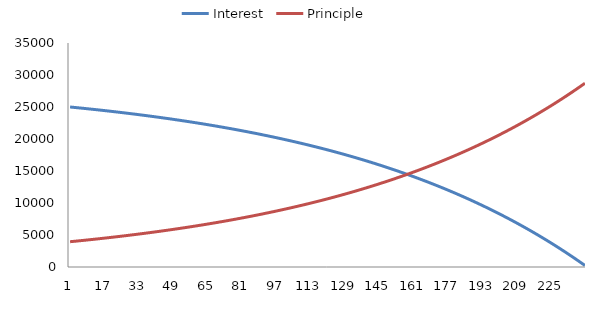
| Category | Interest | Principle |
|---|---|---|
| 0 | 25000 | 3950.649 |
| 1 | 24967.078 | 3983.571 |
| 2 | 24933.881 | 4016.768 |
| 3 | 24900.408 | 4050.241 |
| 4 | 24866.656 | 4083.993 |
| 5 | 24832.623 | 4118.026 |
| 6 | 24798.306 | 4152.343 |
| 7 | 24763.703 | 4186.946 |
| 8 | 24728.812 | 4221.837 |
| 9 | 24693.63 | 4257.019 |
| 10 | 24658.155 | 4292.494 |
| 11 | 24622.384 | 4328.265 |
| 12 | 24586.315 | 4364.334 |
| 13 | 24549.946 | 4400.703 |
| 14 | 24513.273 | 4437.376 |
| 15 | 24476.295 | 4474.354 |
| 16 | 24439.009 | 4511.64 |
| 17 | 24401.412 | 4549.237 |
| 18 | 24363.502 | 4587.148 |
| 19 | 24325.275 | 4625.374 |
| 20 | 24286.731 | 4663.919 |
| 21 | 24247.865 | 4702.785 |
| 22 | 24208.675 | 4741.975 |
| 23 | 24169.158 | 4781.491 |
| 24 | 24129.313 | 4821.337 |
| 25 | 24089.135 | 4861.515 |
| 26 | 24048.622 | 4902.027 |
| 27 | 24007.772 | 4942.877 |
| 28 | 23966.581 | 4984.068 |
| 29 | 23925.047 | 5025.602 |
| 30 | 23883.167 | 5067.482 |
| 31 | 23840.938 | 5109.711 |
| 32 | 23798.357 | 5152.292 |
| 33 | 23755.422 | 5195.228 |
| 34 | 23712.128 | 5238.521 |
| 35 | 23668.474 | 5282.176 |
| 36 | 23624.456 | 5326.194 |
| 37 | 23580.071 | 5370.579 |
| 38 | 23535.316 | 5415.333 |
| 39 | 23490.188 | 5460.461 |
| 40 | 23444.684 | 5505.965 |
| 41 | 23398.801 | 5551.848 |
| 42 | 23352.536 | 5598.114 |
| 43 | 23305.885 | 5644.765 |
| 44 | 23258.845 | 5691.804 |
| 45 | 23211.413 | 5739.236 |
| 46 | 23163.586 | 5787.063 |
| 47 | 23115.361 | 5835.288 |
| 48 | 23066.734 | 5883.916 |
| 49 | 23017.701 | 5932.948 |
| 50 | 22968.26 | 5982.39 |
| 51 | 22918.406 | 6032.243 |
| 52 | 22868.138 | 6082.512 |
| 53 | 22817.45 | 6133.199 |
| 54 | 22766.34 | 6184.309 |
| 55 | 22714.804 | 6235.845 |
| 56 | 22662.839 | 6287.81 |
| 57 | 22610.44 | 6340.209 |
| 58 | 22557.605 | 6393.044 |
| 59 | 22504.33 | 6446.319 |
| 60 | 22450.611 | 6500.039 |
| 61 | 22396.444 | 6554.206 |
| 62 | 22341.825 | 6608.824 |
| 63 | 22286.752 | 6663.898 |
| 64 | 22231.219 | 6719.43 |
| 65 | 22175.224 | 6775.425 |
| 66 | 22118.762 | 6831.887 |
| 67 | 22061.83 | 6888.82 |
| 68 | 22004.423 | 6946.226 |
| 69 | 21946.538 | 7004.112 |
| 70 | 21888.17 | 7062.479 |
| 71 | 21829.316 | 7121.333 |
| 72 | 21769.972 | 7180.678 |
| 73 | 21710.133 | 7240.517 |
| 74 | 21649.795 | 7300.854 |
| 75 | 21588.955 | 7361.695 |
| 76 | 21527.607 | 7423.042 |
| 77 | 21465.748 | 7484.901 |
| 78 | 21403.374 | 7547.275 |
| 79 | 21340.48 | 7610.169 |
| 80 | 21277.062 | 7673.587 |
| 81 | 21213.116 | 7737.534 |
| 82 | 21148.636 | 7802.013 |
| 83 | 21083.619 | 7867.03 |
| 84 | 21018.061 | 7932.588 |
| 85 | 20951.956 | 7998.693 |
| 86 | 20885.3 | 8065.349 |
| 87 | 20818.089 | 8132.56 |
| 88 | 20750.318 | 8200.332 |
| 89 | 20681.982 | 8268.668 |
| 90 | 20613.076 | 8337.573 |
| 91 | 20543.596 | 8407.053 |
| 92 | 20473.537 | 8477.112 |
| 93 | 20402.895 | 8547.755 |
| 94 | 20331.664 | 8618.986 |
| 95 | 20259.839 | 8690.811 |
| 96 | 20187.415 | 8763.234 |
| 97 | 20114.388 | 8836.261 |
| 98 | 20040.753 | 8909.897 |
| 99 | 19966.504 | 8984.146 |
| 100 | 19891.636 | 9059.014 |
| 101 | 19816.144 | 9134.505 |
| 102 | 19740.023 | 9210.626 |
| 103 | 19663.268 | 9287.381 |
| 104 | 19585.873 | 9364.776 |
| 105 | 19507.833 | 9442.816 |
| 106 | 19429.143 | 9521.506 |
| 107 | 19349.797 | 9600.852 |
| 108 | 19269.79 | 9680.859 |
| 109 | 19189.116 | 9761.533 |
| 110 | 19107.77 | 9842.879 |
| 111 | 19025.746 | 9924.903 |
| 112 | 18943.039 | 10007.611 |
| 113 | 18859.642 | 10091.007 |
| 114 | 18775.55 | 10175.099 |
| 115 | 18690.758 | 10259.892 |
| 116 | 18605.259 | 10345.391 |
| 117 | 18519.047 | 10431.602 |
| 118 | 18432.117 | 10518.532 |
| 119 | 18344.463 | 10606.187 |
| 120 | 18256.078 | 10694.572 |
| 121 | 18166.956 | 10783.693 |
| 122 | 18077.092 | 10873.557 |
| 123 | 17986.479 | 10964.17 |
| 124 | 17895.111 | 11055.538 |
| 125 | 17802.982 | 11147.668 |
| 126 | 17710.084 | 11240.565 |
| 127 | 17616.413 | 11334.236 |
| 128 | 17521.961 | 11428.688 |
| 129 | 17426.722 | 11523.927 |
| 130 | 17330.689 | 11619.96 |
| 131 | 17233.856 | 11716.793 |
| 132 | 17136.216 | 11814.433 |
| 133 | 17037.763 | 11912.887 |
| 134 | 16938.489 | 12012.161 |
| 135 | 16838.387 | 12112.262 |
| 136 | 16737.452 | 12213.198 |
| 137 | 16635.675 | 12314.974 |
| 138 | 16533.05 | 12417.599 |
| 139 | 16429.57 | 12521.079 |
| 140 | 16325.228 | 12625.421 |
| 141 | 16220.016 | 12730.633 |
| 142 | 16113.928 | 12836.722 |
| 143 | 16006.955 | 12943.695 |
| 144 | 15899.091 | 13051.559 |
| 145 | 15790.328 | 13160.322 |
| 146 | 15680.658 | 13269.991 |
| 147 | 15570.075 | 13380.574 |
| 148 | 15458.57 | 13492.079 |
| 149 | 15346.136 | 13604.513 |
| 150 | 15232.765 | 13717.884 |
| 151 | 15118.45 | 13832.2 |
| 152 | 15003.181 | 13947.468 |
| 153 | 14886.952 | 14063.697 |
| 154 | 14769.755 | 14180.894 |
| 155 | 14651.581 | 14299.068 |
| 156 | 14532.422 | 14418.227 |
| 157 | 14412.27 | 14538.379 |
| 158 | 14291.117 | 14659.532 |
| 159 | 14168.954 | 14781.695 |
| 160 | 14045.773 | 14904.876 |
| 161 | 13921.566 | 15029.083 |
| 162 | 13796.324 | 15154.326 |
| 163 | 13670.038 | 15280.612 |
| 164 | 13542.699 | 15407.95 |
| 165 | 13414.3 | 15536.35 |
| 166 | 13284.83 | 15665.819 |
| 167 | 13154.282 | 15796.368 |
| 168 | 13022.645 | 15928.004 |
| 169 | 12889.912 | 16060.738 |
| 170 | 12756.072 | 16194.577 |
| 171 | 12621.117 | 16329.532 |
| 172 | 12485.038 | 16465.611 |
| 173 | 12347.825 | 16602.825 |
| 174 | 12209.468 | 16741.182 |
| 175 | 12069.958 | 16880.691 |
| 176 | 11929.285 | 17021.364 |
| 177 | 11787.441 | 17163.209 |
| 178 | 11644.414 | 17306.235 |
| 179 | 11500.195 | 17450.454 |
| 180 | 11354.775 | 17595.874 |
| 181 | 11208.143 | 17742.507 |
| 182 | 11060.288 | 17890.361 |
| 183 | 10911.202 | 18039.447 |
| 184 | 10760.873 | 18189.776 |
| 185 | 10609.292 | 18341.357 |
| 186 | 10456.447 | 18494.202 |
| 187 | 10302.329 | 18648.32 |
| 188 | 10146.926 | 18803.723 |
| 189 | 9990.229 | 18960.421 |
| 190 | 9832.225 | 19118.424 |
| 191 | 9672.905 | 19277.745 |
| 192 | 9512.257 | 19438.392 |
| 193 | 9350.27 | 19600.379 |
| 194 | 9186.934 | 19763.715 |
| 195 | 9022.236 | 19928.413 |
| 196 | 8856.166 | 20094.483 |
| 197 | 8688.712 | 20261.937 |
| 198 | 8519.863 | 20430.787 |
| 199 | 8349.606 | 20601.043 |
| 200 | 8177.931 | 20772.719 |
| 201 | 8004.825 | 20945.825 |
| 202 | 7830.276 | 21120.373 |
| 203 | 7654.273 | 21296.376 |
| 204 | 7476.803 | 21473.846 |
| 205 | 7297.855 | 21652.795 |
| 206 | 7117.415 | 21833.235 |
| 207 | 6935.471 | 22015.178 |
| 208 | 6752.011 | 22198.638 |
| 209 | 6567.023 | 22383.627 |
| 210 | 6380.492 | 22570.157 |
| 211 | 6192.408 | 22758.242 |
| 212 | 6002.756 | 22947.894 |
| 213 | 5811.523 | 23139.126 |
| 214 | 5618.697 | 23331.952 |
| 215 | 5424.264 | 23526.385 |
| 216 | 5228.211 | 23722.438 |
| 217 | 5030.524 | 23920.125 |
| 218 | 4831.19 | 24119.46 |
| 219 | 4630.194 | 24320.455 |
| 220 | 4427.524 | 24523.126 |
| 221 | 4223.164 | 24727.485 |
| 222 | 4017.102 | 24933.547 |
| 223 | 3809.322 | 25141.327 |
| 224 | 3599.811 | 25350.838 |
| 225 | 3388.554 | 25562.095 |
| 226 | 3175.537 | 25775.112 |
| 227 | 2960.744 | 25989.905 |
| 228 | 2744.162 | 26206.488 |
| 229 | 2525.774 | 26424.875 |
| 230 | 2305.567 | 26645.082 |
| 231 | 2083.525 | 26867.125 |
| 232 | 1859.632 | 27091.017 |
| 233 | 1633.873 | 27316.776 |
| 234 | 1406.234 | 27544.416 |
| 235 | 1176.697 | 27773.952 |
| 236 | 945.247 | 28005.402 |
| 237 | 711.869 | 28238.78 |
| 238 | 476.546 | 28474.104 |
| 239 | 239.262 | 28711.388 |